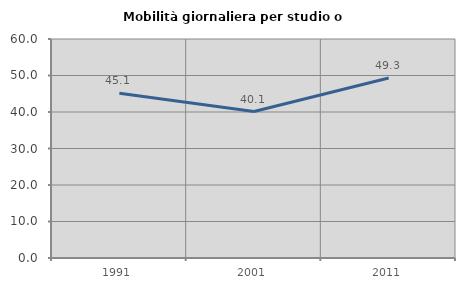
| Category | Mobilità giornaliera per studio o lavoro |
|---|---|
| 1991.0 | 45.149 |
| 2001.0 | 40.131 |
| 2011.0 | 49.315 |